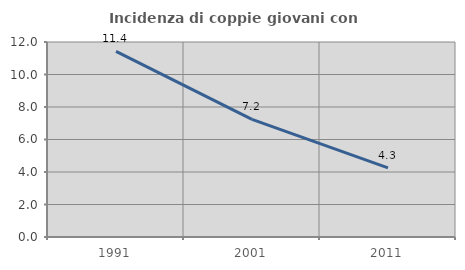
| Category | Incidenza di coppie giovani con figli |
|---|---|
| 1991.0 | 11.423 |
| 2001.0 | 7.233 |
| 2011.0 | 4.252 |